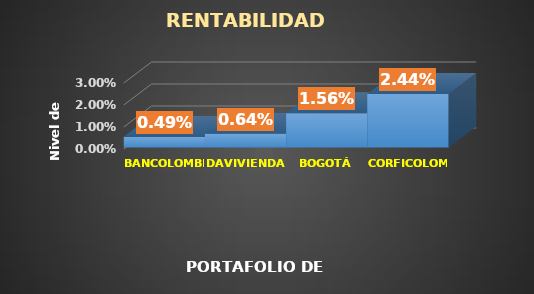
| Category | RENTABILIDAD ESPERADA
/ACCION |
|---|---|
| BANCOLOMBIA | 0.491 |
| DAVIVIENDA | 0.635 |
| BOGOTÁ | 1.561 |
| CORFICOLOMBIANA | 2.437 |